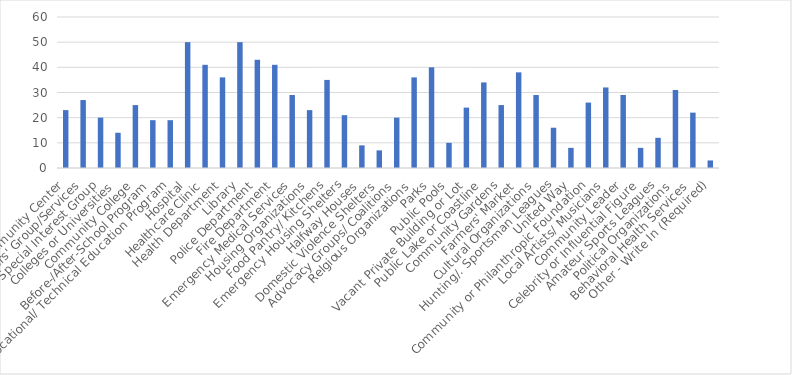
| Category | Number of Responses |
|---|---|
| Community Center | 23 |
| Seniors' Group/Services | 27 |
| Special Interest Group | 20 |
| Colleges or Universities | 14 |
| Community College | 25 |
| Before-/After-School Program | 19 |
| Vocational/ Technical Education Program | 19 |
| Hospital | 50 |
| Healthcare Clinic | 41 |
| Health Department | 36 |
| Library | 50 |
| Police Department | 43 |
| Fire Department | 41 |
| Emergency Medical Services | 29 |
| Housing Organizations | 23 |
| Food Pantry/ Kitchens | 35 |
| Emergency Housing Shelters | 21 |
| Halfway Houses | 9 |
| Domestic Violence Shelters | 7 |
| Advocacy Groups/ Coalitions | 20 |
| Relgious Organizations | 36 |
| Parks | 40 |
| Public Pools | 10 |
| Vacant Private Building or Lot | 24 |
| Public Lake or Coastline | 34 |
| Community Gardens | 25 |
| Farmers' Market | 38 |
| Cultural Organizations | 29 |
| Hunting/. Sportsman Leagues | 16 |
| United Way | 8 |
| Community or Philanthropic Foundation | 26 |
| Local Artists/ Musicians | 32 |
| Community Leader | 29 |
| Celebrity or Influential Figure | 8 |
| Amateur Sports Leagues | 12 |
| Political Organizations | 31 |
| Behavioral Health Services | 22 |
| Other - Write In (Required) | 3 |